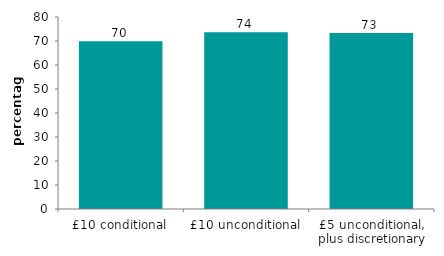
| Category | Series 0 |
|---|---|
| £10 conditional | 69.862 |
| £10 unconditional | 73.652 |
| £5 unconditional, plus discretionary | 73.31 |